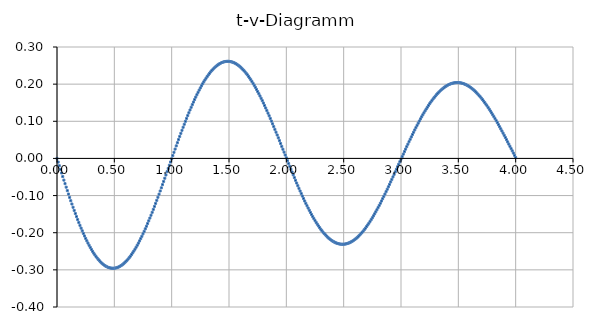
| Category | Series 0 |
|---|---|
| 0.0 | 0 |
| 0.01 | -0.01 |
| 0.02 | -0.02 |
| 0.03 | -0.029 |
| 0.04 | -0.039 |
| 0.05 | -0.049 |
| 0.06 | -0.058 |
| 0.07 | -0.068 |
| 0.08 | -0.077 |
| 0.09 | -0.087 |
| 0.1 | -0.096 |
| 0.11 | -0.105 |
| 0.12 | -0.114 |
| 0.13 | -0.123 |
| 0.14 | -0.131 |
| 0.15 | -0.14 |
| 0.16 | -0.148 |
| 0.17 | -0.157 |
| 0.18 | -0.165 |
| 0.19 | -0.172 |
| 0.2 | -0.18 |
| 0.21 | -0.188 |
| 0.22 | -0.195 |
| 0.23 | -0.202 |
| 0.24 | -0.209 |
| 0.25 | -0.215 |
| 0.26 | -0.222 |
| 0.27 | -0.228 |
| 0.28 | -0.234 |
| 0.29 | -0.239 |
| 0.3 | -0.245 |
| 0.31 | -0.25 |
| 0.32 | -0.255 |
| 0.33 | -0.26 |
| 0.34 | -0.264 |
| 0.35 | -0.268 |
| 0.36 | -0.272 |
| 0.37 | -0.275 |
| 0.38 | -0.279 |
| 0.39 | -0.282 |
| 0.4 | -0.284 |
| 0.41 | -0.287 |
| 0.42 | -0.289 |
| 0.43 | -0.291 |
| 0.44 | -0.292 |
| 0.45 | -0.294 |
| 0.46 | -0.295 |
| 0.47 | -0.295 |
| 0.48 | -0.296 |
| 0.49 | -0.296 |
| 0.5 | -0.296 |
| 0.51 | -0.295 |
| 0.52 | -0.294 |
| 0.53 | -0.293 |
| 0.54 | -0.292 |
| 0.55 | -0.29 |
| 0.56 | -0.288 |
| 0.57 | -0.286 |
| 0.58 | -0.284 |
| 0.59 | -0.281 |
| 0.6 | -0.278 |
| 0.61 | -0.275 |
| 0.62 | -0.271 |
| 0.63 | -0.267 |
| 0.64 | -0.263 |
| 0.65 | -0.259 |
| 0.66 | -0.254 |
| 0.67 | -0.249 |
| 0.68 | -0.244 |
| 0.69 | -0.239 |
| 0.7 | -0.234 |
| 0.71 | -0.228 |
| 0.72 | -0.222 |
| 0.73 | -0.216 |
| 0.74 | -0.21 |
| 0.75 | -0.203 |
| 0.76 | -0.196 |
| 0.77 | -0.19 |
| 0.78 | -0.183 |
| 0.790000000000001 | -0.175 |
| 0.8 | -0.168 |
| 0.810000000000001 | -0.16 |
| 0.82 | -0.153 |
| 0.83 | -0.145 |
| 0.84 | -0.137 |
| 0.850000000000001 | -0.129 |
| 0.860000000000001 | -0.121 |
| 0.87 | -0.113 |
| 0.88 | -0.105 |
| 0.890000000000001 | -0.096 |
| 0.900000000000001 | -0.088 |
| 0.910000000000001 | -0.079 |
| 0.92 | -0.071 |
| 0.930000000000001 | -0.062 |
| 0.940000000000001 | -0.053 |
| 0.950000000000001 | -0.045 |
| 0.960000000000001 | -0.036 |
| 0.970000000000001 | -0.027 |
| 0.980000000000001 | -0.018 |
| 0.990000000000001 | -0.01 |
| 1.0 | -0.001 |
| 1.01 | 0.008 |
| 1.02 | 0.017 |
| 1.03 | 0.025 |
| 1.04 | 0.034 |
| 1.05 | 0.042 |
| 1.06 | 0.051 |
| 1.07 | 0.059 |
| 1.08 | 0.068 |
| 1.09 | 0.076 |
| 1.1 | 0.084 |
| 1.11 | 0.092 |
| 1.12 | 0.1 |
| 1.13 | 0.108 |
| 1.14 | 0.115 |
| 1.15 | 0.123 |
| 1.16 | 0.13 |
| 1.17 | 0.138 |
| 1.18 | 0.145 |
| 1.19 | 0.152 |
| 1.2 | 0.159 |
| 1.21 | 0.165 |
| 1.22 | 0.172 |
| 1.23 | 0.178 |
| 1.24 | 0.184 |
| 1.25 | 0.19 |
| 1.26 | 0.195 |
| 1.27 | 0.201 |
| 1.28 | 0.206 |
| 1.29 | 0.211 |
| 1.3 | 0.216 |
| 1.31 | 0.221 |
| 1.32 | 0.225 |
| 1.33 | 0.229 |
| 1.34 | 0.233 |
| 1.35 | 0.237 |
| 1.36 | 0.24 |
| 1.37 | 0.243 |
| 1.38 | 0.246 |
| 1.39 | 0.249 |
| 1.4 | 0.251 |
| 1.41 | 0.253 |
| 1.42 | 0.255 |
| 1.43 | 0.257 |
| 1.44 | 0.258 |
| 1.45 | 0.259 |
| 1.46 | 0.26 |
| 1.47 | 0.261 |
| 1.48 | 0.261 |
| 1.49 | 0.261 |
| 1.5 | 0.261 |
| 1.51 | 0.261 |
| 1.52 | 0.26 |
| 1.53 | 0.259 |
| 1.54 | 0.258 |
| 1.55 | 0.257 |
| 1.56 | 0.255 |
| 1.57 | 0.253 |
| 1.58 | 0.251 |
| 1.59 | 0.248 |
| 1.6 | 0.246 |
| 1.61 | 0.243 |
| 1.62 | 0.24 |
| 1.63 | 0.236 |
| 1.64 | 0.233 |
| 1.65 | 0.229 |
| 1.66 | 0.225 |
| 1.67 | 0.221 |
| 1.68 | 0.216 |
| 1.69 | 0.212 |
| 1.7 | 0.207 |
| 1.71 | 0.202 |
| 1.72 | 0.197 |
| 1.73 | 0.191 |
| 1.74 | 0.186 |
| 1.75 | 0.18 |
| 1.76 | 0.174 |
| 1.77 | 0.168 |
| 1.78 | 0.162 |
| 1.79 | 0.156 |
| 1.8 | 0.149 |
| 1.81 | 0.143 |
| 1.82 | 0.136 |
| 1.83 | 0.129 |
| 1.84 | 0.122 |
| 1.85 | 0.115 |
| 1.86 | 0.108 |
| 1.87 | 0.1 |
| 1.88 | 0.093 |
| 1.89 | 0.086 |
| 1.9 | 0.078 |
| 1.91 | 0.071 |
| 1.92 | 0.063 |
| 1.93 | 0.056 |
| 1.94 | 0.048 |
| 1.95 | 0.04 |
| 1.96 | 0.032 |
| 1.97 | 0.025 |
| 1.98 | 0.017 |
| 1.99 | 0.009 |
| 2.0 | 0.002 |
| 2.01 | -0.006 |
| 2.02 | -0.014 |
| 2.03 | -0.021 |
| 2.04 | -0.029 |
| 2.05 | -0.037 |
| 2.06 | -0.044 |
| 2.07 | -0.052 |
| 2.08 | -0.059 |
| 2.09 | -0.066 |
| 2.1 | -0.073 |
| 2.11 | -0.081 |
| 2.12 | -0.088 |
| 2.13 | -0.095 |
| 2.14 | -0.101 |
| 2.15 | -0.108 |
| 2.16 | -0.115 |
| 2.17 | -0.121 |
| 2.18 | -0.127 |
| 2.19 | -0.134 |
| 2.2 | -0.14 |
| 2.21 | -0.145 |
| 2.22 | -0.151 |
| 2.23 | -0.157 |
| 2.24 | -0.162 |
| 2.25 | -0.167 |
| 2.26 | -0.172 |
| 2.27 | -0.177 |
| 2.28 | -0.182 |
| 2.29 | -0.186 |
| 2.29999999999999 | -0.191 |
| 2.30999999999999 | -0.195 |
| 2.31999999999999 | -0.198 |
| 2.32999999999999 | -0.202 |
| 2.33999999999999 | -0.206 |
| 2.34999999999999 | -0.209 |
| 2.35999999999999 | -0.212 |
| 2.36999999999999 | -0.215 |
| 2.37999999999999 | -0.217 |
| 2.38999999999999 | -0.22 |
| 2.39999999999999 | -0.222 |
| 2.40999999999999 | -0.224 |
| 2.41999999999999 | -0.225 |
| 2.42999999999999 | -0.227 |
| 2.43999999999999 | -0.228 |
| 2.44999999999999 | -0.229 |
| 2.45999999999999 | -0.23 |
| 2.46999999999999 | -0.231 |
| 2.47999999999999 | -0.231 |
| 2.48999999999999 | -0.231 |
| 2.49999999999999 | -0.231 |
| 2.50999999999999 | -0.231 |
| 2.51999999999999 | -0.23 |
| 2.52999999999999 | -0.229 |
| 2.53999999999999 | -0.228 |
| 2.54999999999999 | -0.227 |
| 2.55999999999999 | -0.226 |
| 2.56999999999999 | -0.224 |
| 2.57999999999999 | -0.222 |
| 2.58999999999999 | -0.22 |
| 2.59999999999999 | -0.218 |
| 2.60999999999999 | -0.215 |
| 2.61999999999999 | -0.212 |
| 2.62999999999999 | -0.209 |
| 2.63999999999999 | -0.206 |
| 2.64999999999999 | -0.203 |
| 2.65999999999999 | -0.199 |
| 2.66999999999999 | -0.196 |
| 2.67999999999999 | -0.192 |
| 2.68999999999999 | -0.188 |
| 2.69999999999999 | -0.183 |
| 2.70999999999999 | -0.179 |
| 2.71999999999999 | -0.174 |
| 2.72999999999999 | -0.17 |
| 2.73999999999999 | -0.165 |
| 2.74999999999999 | -0.16 |
| 2.75999999999999 | -0.155 |
| 2.76999999999998 | -0.149 |
| 2.77999999999998 | -0.144 |
| 2.78999999999998 | -0.138 |
| 2.79999999999998 | -0.132 |
| 2.80999999999998 | -0.127 |
| 2.81999999999998 | -0.121 |
| 2.82999999999998 | -0.115 |
| 2.83999999999998 | -0.108 |
| 2.84999999999998 | -0.102 |
| 2.85999999999998 | -0.096 |
| 2.86999999999998 | -0.089 |
| 2.87999999999998 | -0.083 |
| 2.88999999999998 | -0.076 |
| 2.89999999999998 | -0.07 |
| 2.90999999999998 | -0.063 |
| 2.91999999999998 | -0.056 |
| 2.92999999999998 | -0.05 |
| 2.93999999999998 | -0.043 |
| 2.94999999999998 | -0.036 |
| 2.95999999999998 | -0.029 |
| 2.96999999999998 | -0.023 |
| 2.97999999999998 | -0.016 |
| 2.98999999999998 | -0.009 |
| 2.99999999999998 | -0.002 |
| 3.00999999999998 | 0.005 |
| 3.01999999999998 | 0.012 |
| 3.02999999999998 | 0.018 |
| 3.03999999999998 | 0.025 |
| 3.04999999999998 | 0.032 |
| 3.05999999999998 | 0.038 |
| 3.06999999999998 | 0.045 |
| 3.07999999999998 | 0.051 |
| 3.08999999999998 | 0.058 |
| 3.09999999999998 | 0.064 |
| 3.10999999999998 | 0.071 |
| 3.11999999999998 | 0.077 |
| 3.12999999999998 | 0.083 |
| 3.13999999999998 | 0.089 |
| 3.14999999999998 | 0.095 |
| 3.15999999999998 | 0.101 |
| 3.16999999999998 | 0.106 |
| 3.17999999999998 | 0.112 |
| 3.18999999999998 | 0.117 |
| 3.19999999999998 | 0.123 |
| 3.20999999999998 | 0.128 |
| 3.21999999999998 | 0.133 |
| 3.22999999999997 | 0.138 |
| 3.23999999999997 | 0.143 |
| 3.24999999999997 | 0.147 |
| 3.25999999999997 | 0.152 |
| 3.26999999999997 | 0.156 |
| 3.27999999999997 | 0.16 |
| 3.28999999999997 | 0.164 |
| 3.29999999999997 | 0.168 |
| 3.30999999999997 | 0.172 |
| 3.31999999999997 | 0.175 |
| 3.32999999999997 | 0.178 |
| 3.33999999999997 | 0.181 |
| 3.34999999999997 | 0.184 |
| 3.35999999999997 | 0.187 |
| 3.36999999999997 | 0.19 |
| 3.37999999999997 | 0.192 |
| 3.38999999999997 | 0.194 |
| 3.39999999999997 | 0.196 |
| 3.40999999999997 | 0.198 |
| 3.41999999999997 | 0.199 |
| 3.42999999999997 | 0.2 |
| 3.43999999999997 | 0.202 |
| 3.44999999999997 | 0.203 |
| 3.45999999999997 | 0.203 |
| 3.46999999999997 | 0.204 |
| 3.47999999999997 | 0.204 |
| 3.48999999999997 | 0.204 |
| 3.49999999999997 | 0.204 |
| 3.50999999999997 | 0.204 |
| 3.51999999999997 | 0.203 |
| 3.52999999999997 | 0.203 |
| 3.53999999999997 | 0.202 |
| 3.54999999999997 | 0.201 |
| 3.55999999999997 | 0.199 |
| 3.56999999999997 | 0.198 |
| 3.57999999999997 | 0.196 |
| 3.58999999999997 | 0.195 |
| 3.59999999999997 | 0.192 |
| 3.60999999999997 | 0.19 |
| 3.61999999999997 | 0.188 |
| 3.62999999999997 | 0.185 |
| 3.63999999999997 | 0.183 |
| 3.64999999999997 | 0.18 |
| 3.65999999999997 | 0.177 |
| 3.66999999999997 | 0.173 |
| 3.67999999999997 | 0.17 |
| 3.68999999999997 | 0.166 |
| 3.69999999999996 | 0.162 |
| 3.70999999999996 | 0.159 |
| 3.71999999999996 | 0.155 |
| 3.72999999999996 | 0.15 |
| 3.73999999999996 | 0.146 |
| 3.74999999999996 | 0.142 |
| 3.75999999999996 | 0.137 |
| 3.76999999999996 | 0.132 |
| 3.77999999999996 | 0.128 |
| 3.78999999999996 | 0.123 |
| 3.79999999999996 | 0.118 |
| 3.80999999999996 | 0.112 |
| 3.81999999999996 | 0.107 |
| 3.82999999999996 | 0.102 |
| 3.83999999999996 | 0.096 |
| 3.84999999999996 | 0.091 |
| 3.85999999999996 | 0.085 |
| 3.86999999999996 | 0.08 |
| 3.87999999999996 | 0.074 |
| 3.88999999999996 | 0.068 |
| 3.89999999999996 | 0.062 |
| 3.90999999999996 | 0.056 |
| 3.91999999999996 | 0.051 |
| 3.92999999999996 | 0.045 |
| 3.93999999999996 | 0.039 |
| 3.94999999999996 | 0.033 |
| 3.95999999999996 | 0.027 |
| 3.96999999999996 | 0.021 |
| 3.97999999999996 | 0.014 |
| 3.98999999999996 | 0.008 |
| 3.99999999999996 | 0.002 |